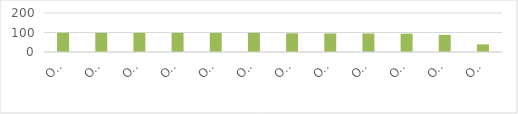
| Category | Series 0 |
|---|---|
| ОГБОУ СПО «Карсунский мед.тех.» | 99 |
| ОГБОУ СПО УТЖТ | 98 |
| ОГБОУ СПО «Димитровградский техникум строительной индустрии» | 98 |
| ОУСПО «Димитровградский техникум профессиональных технологий имени Героя Советского Союза М.С.Чернова» | 98 |
| ОГБОУ СПО "Сурский агротехнологический техникум "  | 98 |
| ОГБОУ СПО«Димитровградский механико-технологический колледж молочной промышленности» | 98 |
| ОГБОУ СПО Ульяновский социально-педагогический колледж №1 | 96 |
| ОГБОУ СПО технологический техникум в р.п. Николаевка  | 95 |
| ОГБОУ СПО технологический техникум р.п.Павловка | 95 |
| ОГБОУ СПО "Ульяновский строительный колледж" | 94 |
| ОГБОУ СПО«Ульяновский электромеханический колледж» | 88 |
| ОГБОУ СПО технологический техникум в р.п.Радищево | 39 |